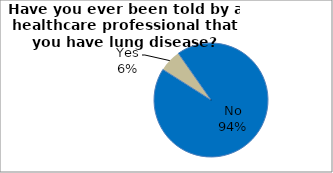
| Category | Series 0 |
|---|---|
| No | 93.72 |
| Yes | 6.28 |